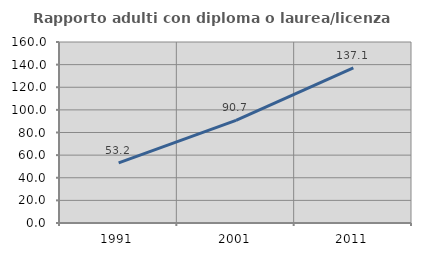
| Category | Rapporto adulti con diploma o laurea/licenza media  |
|---|---|
| 1991.0 | 53.194 |
| 2001.0 | 90.722 |
| 2011.0 | 137.083 |